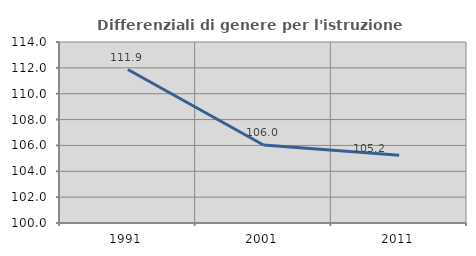
| Category | Differenziali di genere per l'istruzione superiore |
|---|---|
| 1991.0 | 111.871 |
| 2001.0 | 106.031 |
| 2011.0 | 105.232 |